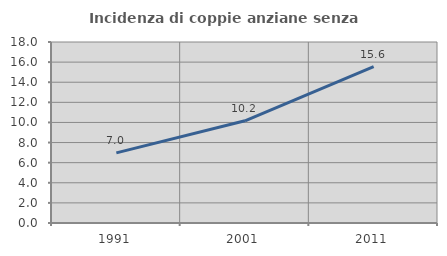
| Category | Incidenza di coppie anziane senza figli  |
|---|---|
| 1991.0 | 6.973 |
| 2001.0 | 10.167 |
| 2011.0 | 15.555 |